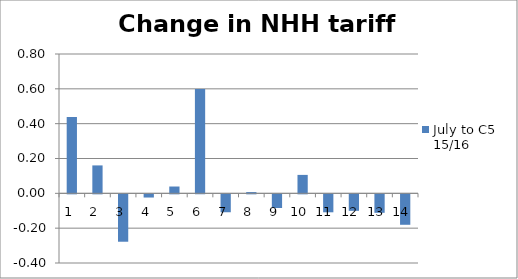
| Category | July to C5 15/16 |
|---|---|
| 1.0 | 0.438 |
| 2.0 | 0.16 |
| 3.0 | -0.272 |
| 4.0 | -0.018 |
| 5.0 | 0.039 |
| 6.0 | 0.599 |
| 7.0 | -0.103 |
| 8.0 | 0.007 |
| 9.0 | -0.078 |
| 10.0 | 0.106 |
| 11.0 | -0.103 |
| 12.0 | -0.095 |
| 13.0 | -0.106 |
| 14.0 | -0.175 |